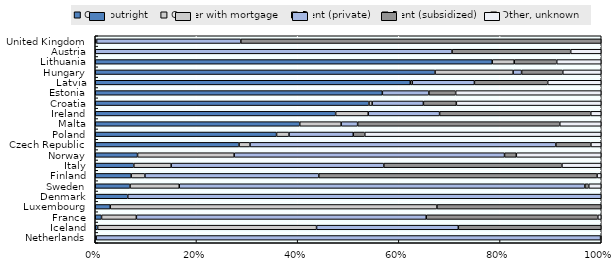
| Category | Own outright | Owner with mortgage | Rent (private) | Rent (subsidized) | Other, unknown |
|---|---|---|---|---|---|
| Netherlands | 0.002 | 0 | 0.997 | 0 | 0.001 |
| Iceland | 0.005 | 0.433 | 0.28 | 0.282 | 0 |
| France | 0.012 | 0.069 | 0.573 | 0.339 | 0.007 |
| Luxembourg | 0.03 | 0.646 | 0 | 0.325 | 0 |
| Denmark | 0.064 | 0 | 0.936 | 0 | 0 |
| Sweden | 0.069 | 0.097 | 0.802 | 0.008 | 0.025 |
| Finland | 0.071 | 0.027 | 0.344 | 0.55 | 0.008 |
| Italy | 0.076 | 0.074 | 0.42 | 0.352 | 0.078 |
| Norway | 0.084 | 0.191 | 0.534 | 0.023 | 0.168 |
| Czech Republic | 0.284 | 0.022 | 0.604 | 0.069 | 0.02 |
| Poland | 0.358 | 0.025 | 0.127 | 0.023 | 0.467 |
| Malta | 0.404 | 0.082 | 0.033 | 0.4 | 0.082 |
| Ireland | 0.475 | 0.064 | 0.141 | 0.299 | 0.021 |
| Croatia | 0.541 | 0.006 | 0.101 | 0.065 | 0.286 |
| Estonia | 0.567 | 0 | 0.092 | 0.053 | 0.288 |
| Latvia | 0.623 | 0.004 | 0.123 | 0.145 | 0.106 |
| Hungary | 0.672 | 0.154 | 0.017 | 0.081 | 0.076 |
| Lithuania | 0.785 | 0.043 | 0 | 0.084 | 0.088 |
| Austria | 0 | 0 | 0.705 | 0.234 | 0.06 |
| United Kingdom | 0 | 0.003 | 0.285 | 0.712 | 0 |